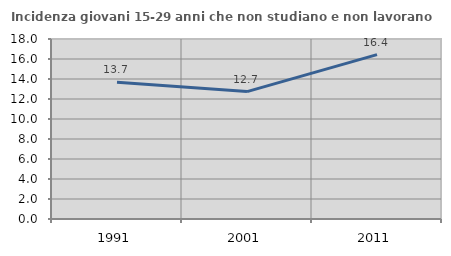
| Category | Incidenza giovani 15-29 anni che non studiano e non lavorano  |
|---|---|
| 1991.0 | 13.67 |
| 2001.0 | 12.742 |
| 2011.0 | 16.436 |